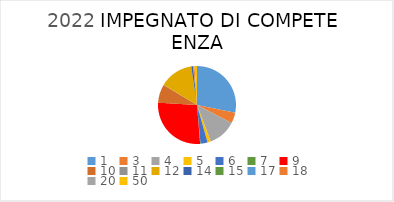
| Category | Series 0 |
|---|---|
| 1.0 | 2818775.11 |
| 3.0 | 445398.87 |
| 4.0 | 1162048.91 |
| 5.0 | 138510.56 |
| 6.0 | 294825.04 |
| 7.0 | 15000 |
| 9.0 | 2724069.38 |
| 10.0 | 766438.8 |
| 11.0 | 4000 |
| 12.0 | 1396795.75 |
| 14.0 | 76091.18 |
| 15.0 | 4565.71 |
| 17.0 | 6954 |
| 18.0 | 47999.39 |
| 20.0 | 0 |
| 50.0 | 101388.82 |